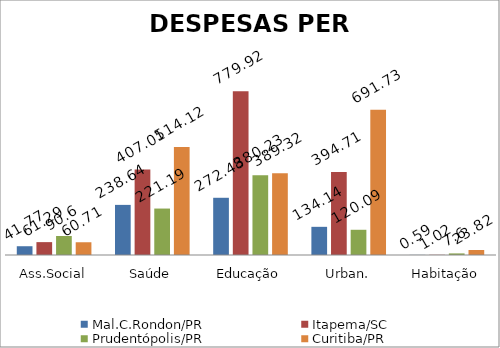
| Category | Mal.C.Rondon/PR | Itapema/SC | Prudentópolis/PR | Toledo/PR | Cascavel/PR | Curitiba/PR |
|---|---|---|---|---|---|---|
| Ass.Social | 41.77 | 61.29 | 90.6 |  |  | 60.71 |
| Saúde | 238.64 | 407.01 | 221.19 |  |  | 514.12 |
| Educação | 272.48 | 779.92 | 380.23 |  |  | 389.32 |
| Urban. | 134.14 | 394.71 | 120.09 |  |  | 691.73 |
| Habitação | 0.59 | 1.02 | 7.6 |  |  | 23.82 |